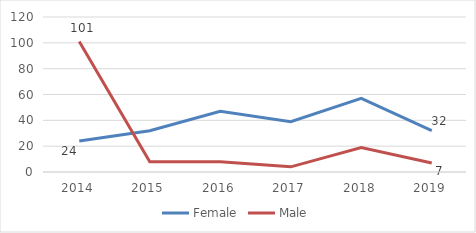
| Category | Female | Male |
|---|---|---|
| 2014.0 | 24 | 101 |
| 2015.0 | 32 | 8 |
| 2016.0 | 47 | 8 |
| 2017.0 | 39 | 4 |
| 2018.0 | 57 | 19 |
| 2019.0 | 32 | 7 |